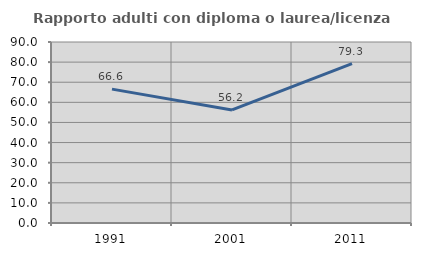
| Category | Rapporto adulti con diploma o laurea/licenza media  |
|---|---|
| 1991.0 | 66.568 |
| 2001.0 | 56.218 |
| 2011.0 | 79.287 |